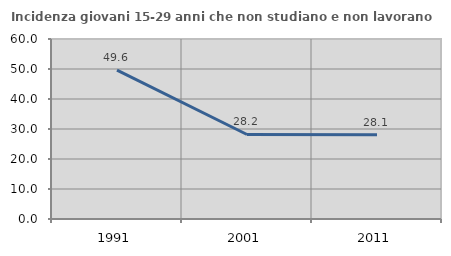
| Category | Incidenza giovani 15-29 anni che non studiano e non lavorano  |
|---|---|
| 1991.0 | 49.645 |
| 2001.0 | 28.169 |
| 2011.0 | 28.125 |